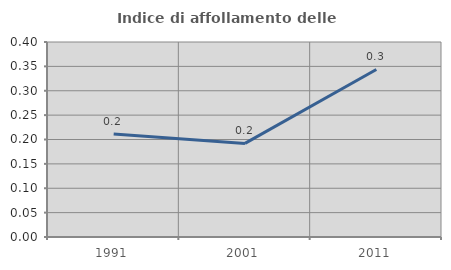
| Category | Indice di affollamento delle abitazioni  |
|---|---|
| 1991.0 | 0.211 |
| 2001.0 | 0.192 |
| 2011.0 | 0.344 |